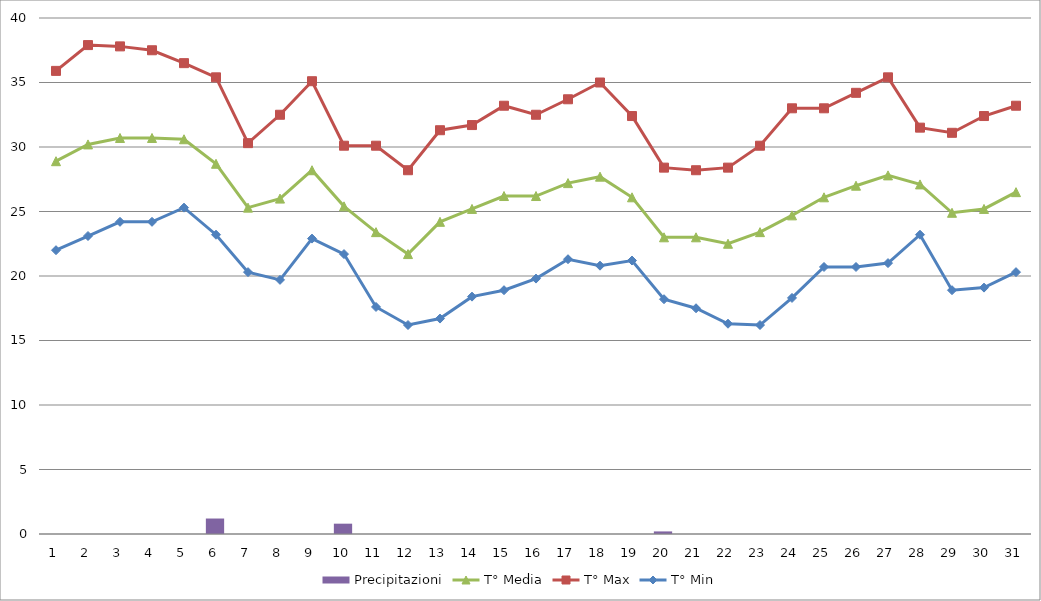
| Category | Precipitazioni |
|---|---|
| 0 | 0 |
| 1 | 0 |
| 2 | 0 |
| 3 | 0 |
| 4 | 0 |
| 5 | 1.2 |
| 6 | 0 |
| 7 | 0 |
| 8 | 0 |
| 9 | 0.8 |
| 10 | 0 |
| 11 | 0 |
| 12 | 0 |
| 13 | 0 |
| 14 | 0 |
| 15 | 0 |
| 16 | 0 |
| 17 | 0 |
| 18 | 0 |
| 19 | 0.2 |
| 20 | 0 |
| 21 | 0 |
| 22 | 0 |
| 23 | 0 |
| 24 | 0 |
| 25 | 0 |
| 26 | 0 |
| 27 | 0 |
| 28 | 0 |
| 29 | 0 |
| 30 | 0 |